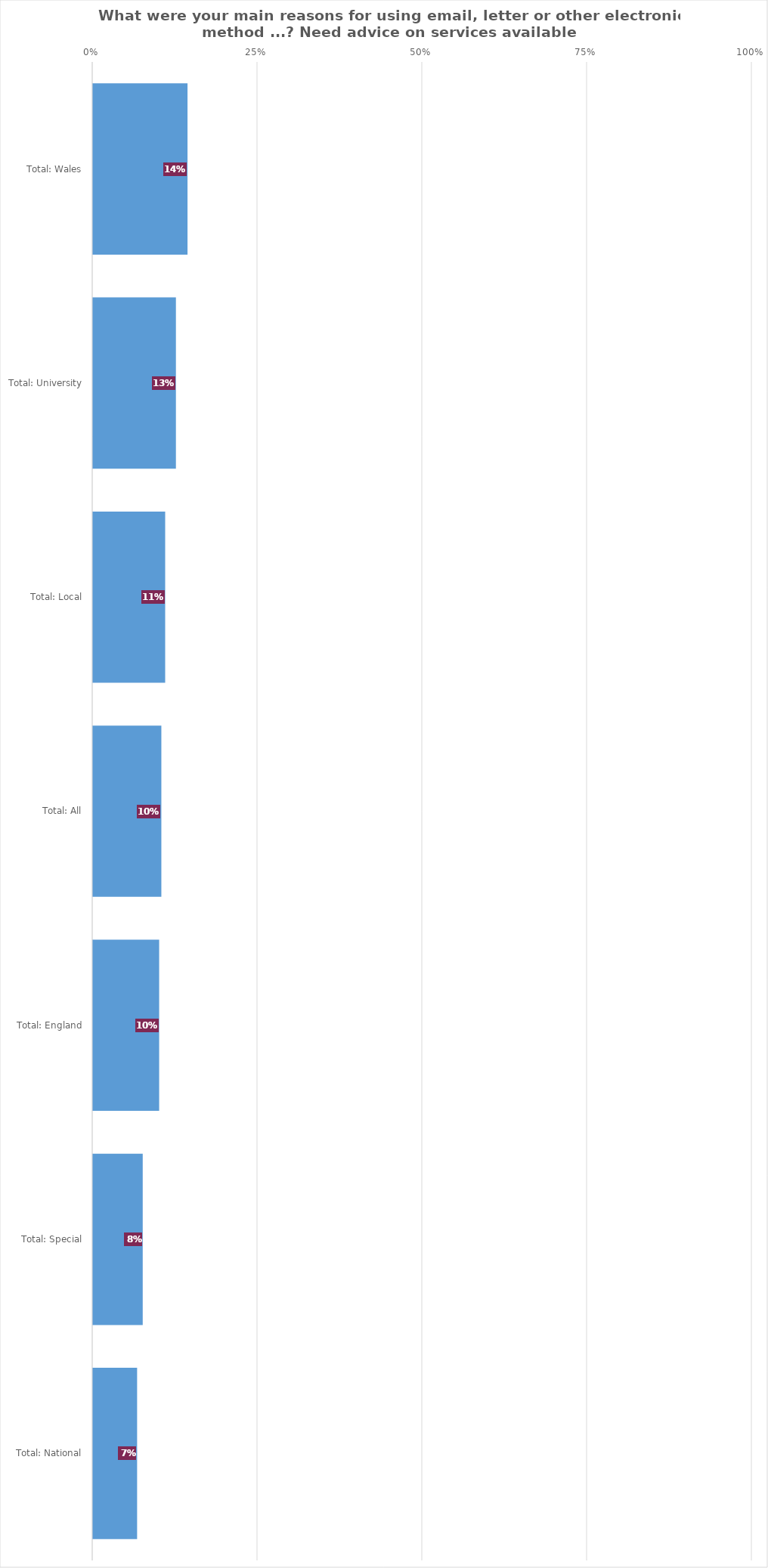
| Category | Need advice on services available |
|---|---|
| Total: Wales | 0.143 |
| Total: University | 0.126 |
| Total: Local | 0.11 |
| Total: All | 0.104 |
| Total: England | 0.1 |
| Total: Special | 0.075 |
| Total: National | 0.067 |